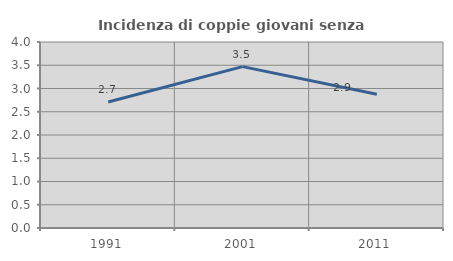
| Category | Incidenza di coppie giovani senza figli |
|---|---|
| 1991.0 | 2.71 |
| 2001.0 | 3.47 |
| 2011.0 | 2.878 |